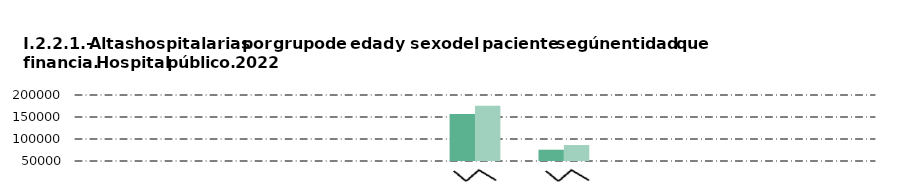
| Category |     Hombre |     Mujer |
|---|---|---|
| Andalucía | 386 | 319 |
| Castilla y León  | 1018 | 951 |
| Castilla - La Mancha | 2507 | 2150 |
| Extremadura | 646 | 503 |
| Madrid (Comunidad de) | 156644 | 175765 |
| Resto de CC.AA. | 75655 | 86246 |
| Mutualidades y aseguradoras | 2836 | 1696 |
| Particulares | 2575 | 2590 |
| Otros | 504 | 873 |